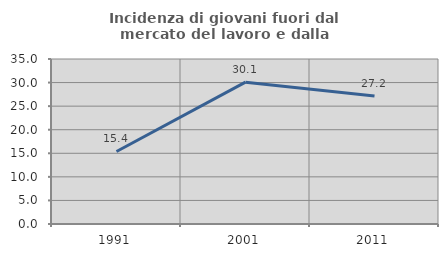
| Category | Incidenza di giovani fuori dal mercato del lavoro e dalla formazione  |
|---|---|
| 1991.0 | 15.385 |
| 2001.0 | 30.081 |
| 2011.0 | 27.165 |